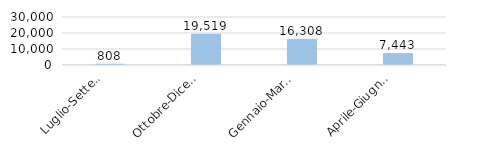
| Category | Italia |
|---|---|
| Luglio-Settembre 
2020 | 807.62 |
| Ottobre-Dicembre 
2020 | 19518.783 |
| Gennaio-Marzo 
2021 | 16308.244 |
| Aprile-Giugno
 2021 | 7443.22 |